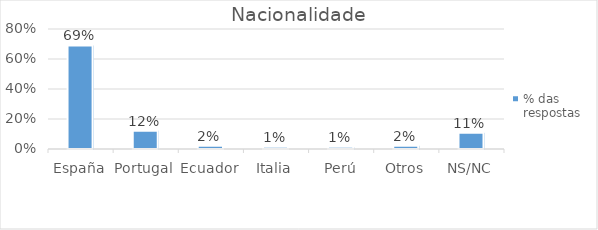
| Category | % das respostas |
|---|---|
| España | 0.691 |
| Portugal | 0.122 |
| Ecuador | 0.022 |
| Italia | 0.014 |
| Perú | 0.014 |
| Otros | 0.022 |
| NS/NC | 0.108 |